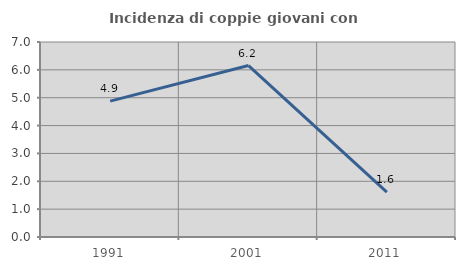
| Category | Incidenza di coppie giovani con figli |
|---|---|
| 1991.0 | 4.878 |
| 2001.0 | 6.154 |
| 2011.0 | 1.613 |